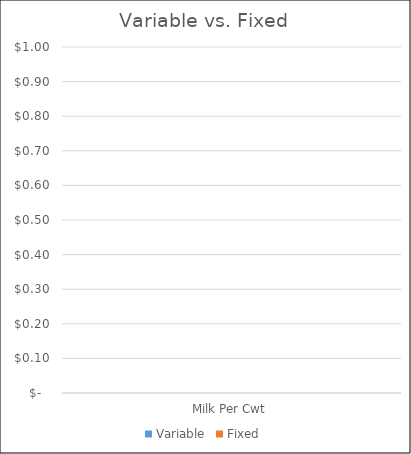
| Category | Variable | Fixed |
|---|---|---|
| 0 | 0 | 0 |